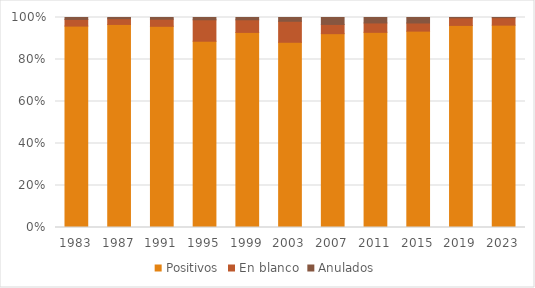
| Category | Positivos | En blanco | Anulados |
|---|---|---|---|
| 1983.0 | 95.9 | 3.2 | 0.9 |
| 1987.0 | 96.7 | 2.7 | 0.6 |
| 1991.0 | 95.9 | 3.4 | 0.8 |
| 1995.0 | 88.7 | 10.2 | 1.1 |
| 1999.0 | 92.9 | 6 | 1.1 |
| 2003.0 | 88.2 | 10 | 1.8 |
| 2007.0 | 92.3 | 4.4 | 3.3 |
| 2011.0 | 92.927 | 4.476 | 2.597 |
| 2015.0 | 93.507 | 3.875 | 2.618 |
| 2019.0 | 96.232 | 3.585 | 0.183 |
| 2023.0 | 96.359 | 3.541 | 0.1 |